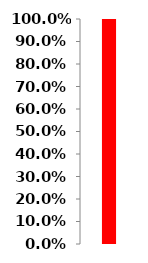
| Category | Series 0 |
|---|---|
| 0 | 1.017 |